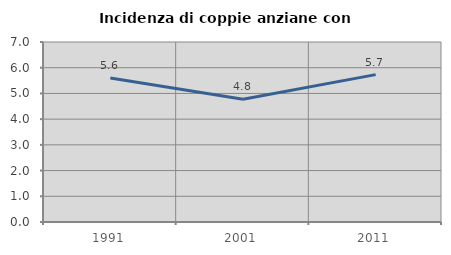
| Category | Incidenza di coppie anziane con figli |
|---|---|
| 1991.0 | 5.603 |
| 2001.0 | 4.77 |
| 2011.0 | 5.731 |